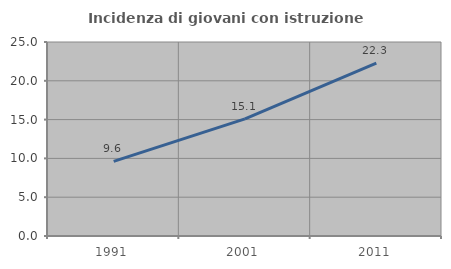
| Category | Incidenza di giovani con istruzione universitaria |
|---|---|
| 1991.0 | 9.616 |
| 2001.0 | 15.092 |
| 2011.0 | 22.282 |